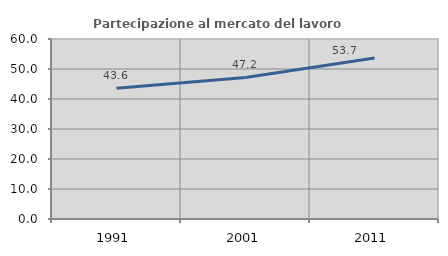
| Category | Partecipazione al mercato del lavoro  femminile |
|---|---|
| 1991.0 | 43.588 |
| 2001.0 | 47.176 |
| 2011.0 | 53.678 |